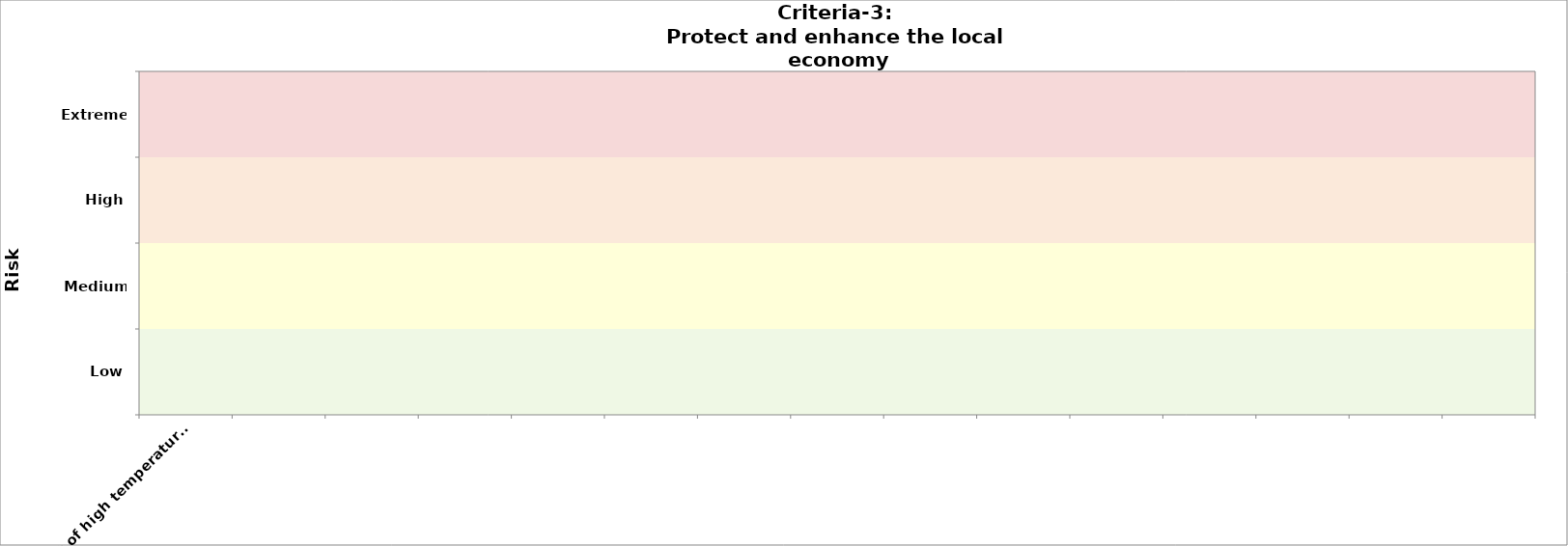
| Category | Criteria-3 (public health) | Criteria-3 
2050 |
|---|---|---|
| e.g. effect of high temperature on road pavement  |  | 0 |